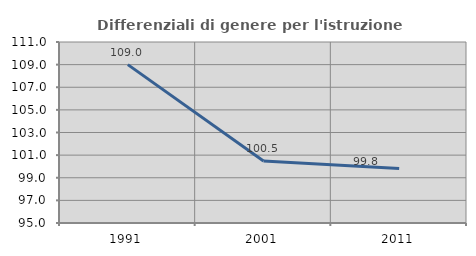
| Category | Differenziali di genere per l'istruzione superiore |
|---|---|
| 1991.0 | 109.001 |
| 2001.0 | 100.483 |
| 2011.0 | 99.813 |